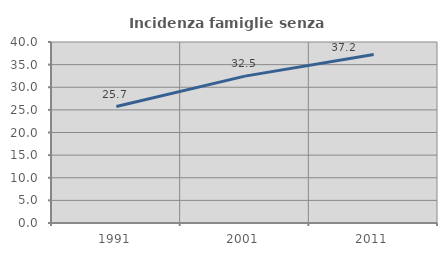
| Category | Incidenza famiglie senza nuclei |
|---|---|
| 1991.0 | 25.737 |
| 2001.0 | 32.461 |
| 2011.0 | 37.23 |